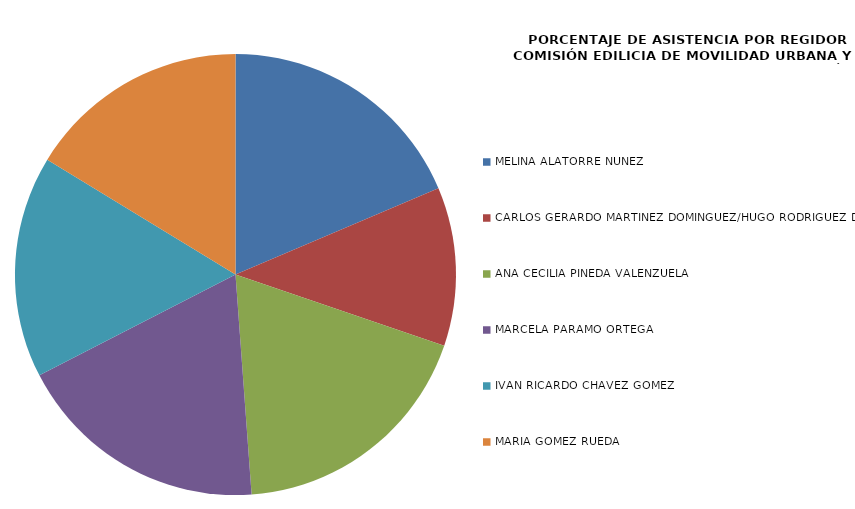
| Category | Series 0 |
|---|---|
| MELINA ALATORRE NÚÑEZ | 100 |
| CARLOS GERARDO MARTÍNEZ DOMÍNGUEZ/HUGO RODRÍGUEZ DÍAZ | 62.5 |
| ANA CECILIA PINEDA VALENZUELA | 100 |
| MARCELA PARÁMO ORTEGA | 100 |
| IVÁN RICARDO CHÁVEZ GÓMEZ | 87.5 |
| MARÍA GÓMEZ RUEDA | 87.5 |